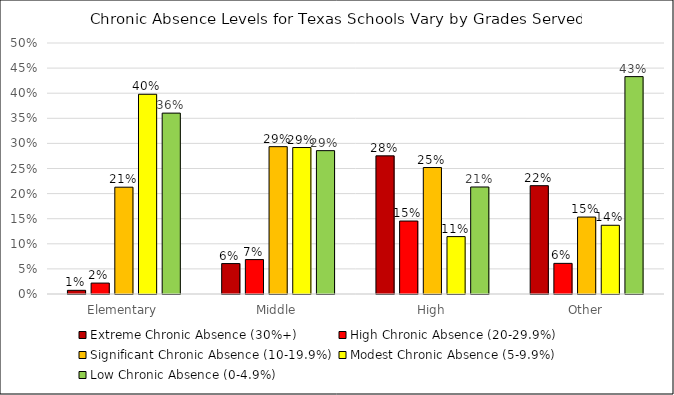
| Category | Extreme Chronic Absence (30%+) | High Chronic Absence (20-29.9%) | Significant Chronic Absence (10-19.9%) | Modest Chronic Absence (5-9.9%) | Low Chronic Absence (0-4.9%) |
|---|---|---|---|---|---|
| Elementary | 0.007 | 0.022 | 0.213 | 0.398 | 0.36 |
| Middle | 0.061 | 0.069 | 0.293 | 0.292 | 0.286 |
| High | 0.275 | 0.145 | 0.252 | 0.114 | 0.213 |
| Other | 0.216 | 0.061 | 0.153 | 0.137 | 0.433 |